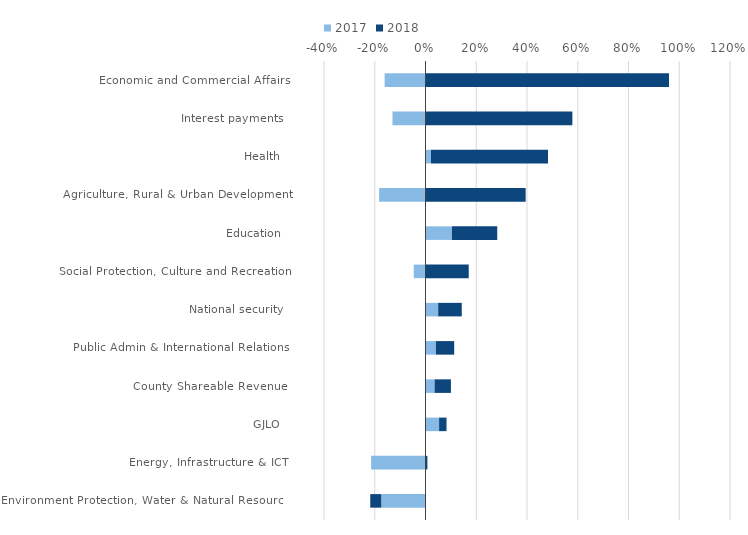
| Category | 2017 | 2018 |
|---|---|---|
| Environment Protection, Water & Natural Resources | -0.174 | -0.044 |
| Energy, Infrastructure & ICT | -0.214 | 0.007 |
| GJLO | 0.054 | 0.029 |
| County Shareable Revenue | 0.036 | 0.064 |
| Public Admin & International Relations | 0.041 | 0.072 |
| National security | 0.05 | 0.093 |
| Social Protection, Culture and Recreation | -0.046 | 0.17 |
| Education | 0.104 | 0.179 |
| Agriculture, Rural & Urban Development | -0.183 | 0.395 |
| Health | 0.022 | 0.461 |
| Interest payments | -0.13 | 0.579 |
| Economic and Commercial Affairs | -0.161 | 0.96 |